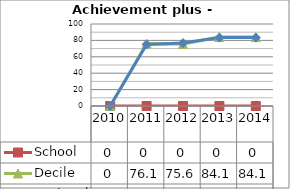
| Category | School  | Decile | National |
|---|---|---|---|
| 2010.0 | 0 | 0 | 0 |
| 2011.0 | 0 | 76.1 | 75.1 |
| 2012.0 | 0 | 75.6 | 76.8 |
| 2013.0 | 0 | 84.1 | 83.4 |
| 2014.0 | 0 | 84.1 | 83.4 |